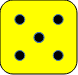
| Category | Series 0 |
|---|---|
| 0.1 | 0.1 |
| 0.5 | 0.5 |
| 0.1 | 0.9 |
| 0.9 | 0.1 |
| 0.5 | 0.5 |
| 0.9 | 0.9 |